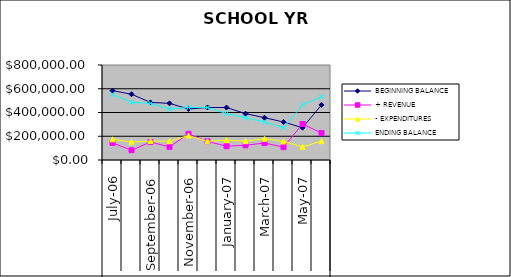
| Category | BEGINNING BALANCE | + REVENUE | - EXPENDITURES | ENDING BALANCE |
|---|---|---|---|---|
| 0 | 584197.88 | 144296.79 | 174545.29 | 553949.38 |
| 1 | 553949.38 | 82354.34 | 151189.28 | 485114.44 |
| 2 | 485114.44 | 150871.71 | 159006.47 | 476979.68 |
| 3 | 476979.68 | 110284.19 | 157973.72 | 429290.15 |
| 4 | 429290.15 | 219569.26 | 206654.45 | 442204.96 |
| 5 | 442204.96 | 156988.07 | 157283.92 | 441909.11 |
| 6 | 441909.11 | 116118.58 | 167366.56 | 390661.13 |
| 7 | 390661.13 | 124052.71 | 158477.68 | 356236.16 |
| 8 | 356236.16 | 143094.02 | 179269.74 | 320060.44 |
| 9 | 320060.44 | 108176.26 | 156357.21 | 271879.49 |
| 10 | 271879.49 | 303012.52 | 110901.89 | 463990.12 |
| 11 | 463990.12 | 226791.22 | 158761.53 | 532019.81 |